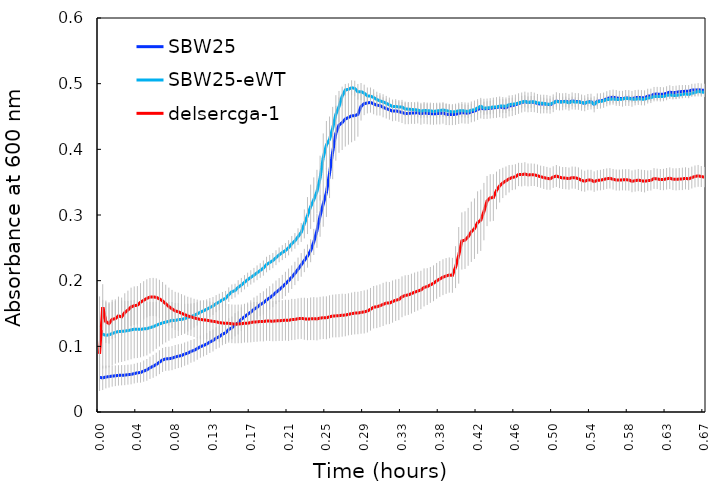
| Category | SBW25 | SBW25-eWT | delsercga-1 |
|---|---|---|---|
| 0.00010416666666666667 | 0.053 | 0.12 | 0.088 |
| 0.0035763888888888894 | 0.052 | 0.118 | 0.16 |
| 0.0070486111111111105 | 0.053 | 0.117 | 0.137 |
| 0.010520833333333333 | 0.054 | 0.118 | 0.135 |
| 0.013993055555555555 | 0.055 | 0.119 | 0.141 |
| 0.017465277777777777 | 0.055 | 0.121 | 0.142 |
| 0.020937499999999998 | 0.056 | 0.123 | 0.146 |
| 0.02440972222222222 | 0.056 | 0.123 | 0.145 |
| 0.027881944444444445 | 0.056 | 0.123 | 0.151 |
| 0.03135416666666666 | 0.057 | 0.124 | 0.155 |
| 0.034826388888888886 | 0.057 | 0.125 | 0.16 |
| 0.03829861111111111 | 0.058 | 0.126 | 0.162 |
| 0.04177083333333333 | 0.06 | 0.126 | 0.163 |
| 0.04524305555555556 | 0.06 | 0.126 | 0.167 |
| 0.04871527777777778 | 0.062 | 0.127 | 0.17 |
| 0.0521875 | 0.064 | 0.127 | 0.173 |
| 0.05565972222222223 | 0.067 | 0.128 | 0.175 |
| 0.059131944444444445 | 0.07 | 0.13 | 0.175 |
| 0.06260416666666667 | 0.072 | 0.132 | 0.175 |
| 0.06607638888888889 | 0.076 | 0.134 | 0.172 |
| 0.06954861111111112 | 0.079 | 0.136 | 0.169 |
| 0.07302083333333333 | 0.081 | 0.137 | 0.165 |
| 0.07649305555555556 | 0.081 | 0.138 | 0.161 |
| 0.07996527777777777 | 0.082 | 0.14 | 0.157 |
| 0.0834375 | 0.084 | 0.139 | 0.154 |
| 0.08690972222222222 | 0.085 | 0.141 | 0.153 |
| 0.09038194444444443 | 0.086 | 0.141 | 0.15 |
| 0.09385416666666667 | 0.088 | 0.142 | 0.148 |
| 0.09732638888888889 | 0.09 | 0.144 | 0.146 |
| 0.1007986111111111 | 0.092 | 0.145 | 0.145 |
| 0.10427083333333333 | 0.094 | 0.147 | 0.143 |
| 0.10774305555555556 | 0.097 | 0.149 | 0.142 |
| 0.11121527777777777 | 0.099 | 0.152 | 0.141 |
| 0.1146875 | 0.101 | 0.154 | 0.14 |
| 0.11815972222222222 | 0.104 | 0.156 | 0.14 |
| 0.12163194444444443 | 0.107 | 0.159 | 0.139 |
| 0.12510416666666666 | 0.109 | 0.161 | 0.138 |
| 0.1285763888888889 | 0.112 | 0.165 | 0.137 |
| 0.1320486111111111 | 0.115 | 0.168 | 0.136 |
| 0.13552083333333334 | 0.118 | 0.171 | 0.136 |
| 0.13899305555555555 | 0.121 | 0.173 | 0.135 |
| 0.14246527777777776 | 0.126 | 0.179 | 0.135 |
| 0.1459375 | 0.128 | 0.183 | 0.134 |
| 0.14940972222222224 | 0.133 | 0.185 | 0.134 |
| 0.15288194444444445 | 0.136 | 0.19 | 0.134 |
| 0.15635416666666666 | 0.141 | 0.193 | 0.134 |
| 0.1598263888888889 | 0.145 | 0.198 | 0.135 |
| 0.1632986111111111 | 0.149 | 0.201 | 0.135 |
| 0.16677083333333334 | 0.152 | 0.205 | 0.136 |
| 0.17024305555555555 | 0.156 | 0.208 | 0.137 |
| 0.17371527777777776 | 0.159 | 0.212 | 0.137 |
| 0.17718750000000003 | 0.164 | 0.215 | 0.138 |
| 0.18065972222222224 | 0.166 | 0.219 | 0.138 |
| 0.18413194444444445 | 0.171 | 0.225 | 0.139 |
| 0.18760416666666666 | 0.174 | 0.228 | 0.138 |
| 0.1910763888888889 | 0.178 | 0.231 | 0.138 |
| 0.1945486111111111 | 0.182 | 0.235 | 0.139 |
| 0.1980208333333333 | 0.186 | 0.239 | 0.139 |
| 0.20149305555555555 | 0.191 | 0.243 | 0.139 |
| 0.20496527777777776 | 0.195 | 0.246 | 0.14 |
| 0.20843750000000003 | 0.2 | 0.25 | 0.139 |
| 0.21190972222222224 | 0.205 | 0.256 | 0.141 |
| 0.21538194444444445 | 0.211 | 0.261 | 0.141 |
| 0.21885416666666668 | 0.217 | 0.267 | 0.142 |
| 0.2223263888888889 | 0.224 | 0.273 | 0.143 |
| 0.2257986111111111 | 0.231 | 0.286 | 0.142 |
| 0.2292708333333333 | 0.237 | 0.299 | 0.141 |
| 0.23274305555555555 | 0.246 | 0.313 | 0.142 |
| 0.23621527777777776 | 0.259 | 0.323 | 0.142 |
| 0.23968749999999997 | 0.276 | 0.336 | 0.142 |
| 0.24315972222222224 | 0.299 | 0.356 | 0.143 |
| 0.24663194444444445 | 0.317 | 0.388 | 0.144 |
| 0.2501041666666667 | 0.334 | 0.406 | 0.143 |
| 0.2535763888888889 | 0.364 | 0.415 | 0.145 |
| 0.2570486111111111 | 0.396 | 0.432 | 0.146 |
| 0.26052083333333337 | 0.424 | 0.453 | 0.146 |
| 0.2639930555555556 | 0.437 | 0.465 | 0.147 |
| 0.2674652777777778 | 0.441 | 0.481 | 0.147 |
| 0.27092592592592596 | 0.446 | 0.49 | 0.148 |
| 0.2744097222222222 | 0.448 | 0.491 | 0.149 |
| 0.2778819444444444 | 0.451 | 0.494 | 0.15 |
| 0.2813541666666666 | 0.451 | 0.493 | 0.151 |
| 0.2848263888888889 | 0.453 | 0.488 | 0.151 |
| 0.2882986111111111 | 0.465 | 0.488 | 0.152 |
| 0.29177083333333337 | 0.47 | 0.486 | 0.152 |
| 0.2952430555555556 | 0.471 | 0.481 | 0.154 |
| 0.2987152777777778 | 0.471 | 0.481 | 0.156 |
| 0.3021875 | 0.469 | 0.479 | 0.16 |
| 0.3056597222222222 | 0.467 | 0.476 | 0.16 |
| 0.3091319444444444 | 0.467 | 0.474 | 0.162 |
| 0.3126041666666666 | 0.464 | 0.472 | 0.164 |
| 0.3160763888888889 | 0.462 | 0.47 | 0.166 |
| 0.3195486111111111 | 0.46 | 0.468 | 0.166 |
| 0.3230208333333333 | 0.458 | 0.465 | 0.168 |
| 0.3264930555555556 | 0.459 | 0.465 | 0.17 |
| 0.3299652777777778 | 0.457 | 0.464 | 0.171 |
| 0.3334375 | 0.456 | 0.464 | 0.175 |
| 0.3369097222222222 | 0.455 | 0.462 | 0.177 |
| 0.3403819444444445 | 0.455 | 0.461 | 0.178 |
| 0.3438541666666666 | 0.455 | 0.461 | 0.18 |
| 0.3473263888888889 | 0.455 | 0.46 | 0.182 |
| 0.35079861111111116 | 0.456 | 0.46 | 0.184 |
| 0.3542708333333333 | 0.454 | 0.458 | 0.186 |
| 0.3577430555555556 | 0.455 | 0.459 | 0.19 |
| 0.3612152777777778 | 0.455 | 0.459 | 0.191 |
| 0.3646875 | 0.454 | 0.459 | 0.194 |
| 0.3681597222222222 | 0.454 | 0.458 | 0.196 |
| 0.3716319444444445 | 0.454 | 0.458 | 0.2 |
| 0.3751041666666666 | 0.455 | 0.459 | 0.203 |
| 0.3785763888888889 | 0.455 | 0.46 | 0.205 |
| 0.38204861111111116 | 0.453 | 0.459 | 0.207 |
| 0.3855208333333333 | 0.453 | 0.458 | 0.209 |
| 0.3889930555555556 | 0.453 | 0.457 | 0.208 |
| 0.3924652777777778 | 0.453 | 0.457 | 0.221 |
| 0.3959375 | 0.455 | 0.459 | 0.239 |
| 0.3994097222222222 | 0.456 | 0.459 | 0.26 |
| 0.4028819444444445 | 0.455 | 0.458 | 0.262 |
| 0.4063541666666666 | 0.455 | 0.458 | 0.267 |
| 0.4098263888888889 | 0.457 | 0.46 | 0.274 |
| 0.41329861111111116 | 0.458 | 0.46 | 0.279 |
| 0.4167708333333333 | 0.461 | 0.463 | 0.288 |
| 0.4202430555555556 | 0.463 | 0.466 | 0.292 |
| 0.4237152777777778 | 0.462 | 0.463 | 0.305 |
| 0.4271875 | 0.462 | 0.463 | 0.321 |
| 0.4306597222222222 | 0.462 | 0.464 | 0.326 |
| 0.4341319444444445 | 0.463 | 0.465 | 0.327 |
| 0.4376041666666666 | 0.464 | 0.464 | 0.337 |
| 0.4410763888888889 | 0.465 | 0.466 | 0.344 |
| 0.44454861111111116 | 0.463 | 0.466 | 0.349 |
| 0.4480208333333333 | 0.463 | 0.466 | 0.352 |
| 0.4514930555555556 | 0.466 | 0.468 | 0.355 |
| 0.4549652777777778 | 0.467 | 0.469 | 0.357 |
| 0.4584375 | 0.468 | 0.469 | 0.358 |
| 0.4619097222222222 | 0.47 | 0.471 | 0.362 |
| 0.4653819444444445 | 0.471 | 0.472 | 0.361 |
| 0.4688541666666666 | 0.473 | 0.473 | 0.362 |
| 0.4723263888888889 | 0.471 | 0.471 | 0.361 |
| 0.47579861111111116 | 0.472 | 0.472 | 0.361 |
| 0.4792708333333333 | 0.471 | 0.472 | 0.361 |
| 0.4827430555555556 | 0.47 | 0.471 | 0.36 |
| 0.4862152777777778 | 0.469 | 0.47 | 0.358 |
| 0.4896875 | 0.469 | 0.47 | 0.357 |
| 0.4931597222222222 | 0.469 | 0.469 | 0.356 |
| 0.4966319444444445 | 0.468 | 0.469 | 0.355 |
| 0.5001041666666667 | 0.47 | 0.471 | 0.358 |
| 0.5035763888888889 | 0.474 | 0.473 | 0.359 |
| 0.5070486111111111 | 0.472 | 0.472 | 0.358 |
| 0.5105208333333333 | 0.472 | 0.472 | 0.356 |
| 0.5139930555555555 | 0.473 | 0.473 | 0.356 |
| 0.5174652777777778 | 0.472 | 0.471 | 0.355 |
| 0.5209374999999999 | 0.474 | 0.473 | 0.357 |
| 0.5244097222222223 | 0.473 | 0.472 | 0.357 |
| 0.5278819444444445 | 0.473 | 0.472 | 0.355 |
| 0.5313541666666667 | 0.471 | 0.471 | 0.353 |
| 0.5348263888888889 | 0.47 | 0.47 | 0.351 |
| 0.5382986111111111 | 0.472 | 0.472 | 0.353 |
| 0.5417708333333333 | 0.473 | 0.472 | 0.353 |
| 0.5452430555555555 | 0.469 | 0.469 | 0.351 |
| 0.5487152777777778 | 0.473 | 0.472 | 0.353 |
| 0.5521874999999999 | 0.474 | 0.473 | 0.353 |
| 0.5556597222222223 | 0.475 | 0.474 | 0.354 |
| 0.5591319444444445 | 0.477 | 0.476 | 0.355 |
| 0.5626041666666667 | 0.479 | 0.476 | 0.356 |
| 0.5660763888888889 | 0.479 | 0.477 | 0.354 |
| 0.5695486111111111 | 0.478 | 0.476 | 0.353 |
| 0.5730208333333333 | 0.478 | 0.476 | 0.353 |
| 0.5764930555555555 | 0.477 | 0.476 | 0.354 |
| 0.5799652777777778 | 0.478 | 0.478 | 0.354 |
| 0.5834374999999999 | 0.478 | 0.477 | 0.353 |
| 0.5869097222222223 | 0.477 | 0.477 | 0.351 |
| 0.5903819444444445 | 0.479 | 0.476 | 0.352 |
| 0.5938541666666667 | 0.479 | 0.477 | 0.353 |
| 0.5973263888888889 | 0.479 | 0.476 | 0.352 |
| 0.6007986111111111 | 0.478 | 0.476 | 0.351 |
| 0.6042708333333333 | 0.481 | 0.478 | 0.352 |
| 0.6077430555555555 | 0.481 | 0.479 | 0.353 |
| 0.6112152777777778 | 0.484 | 0.48 | 0.356 |
| 0.6146874999999999 | 0.484 | 0.481 | 0.355 |
| 0.6181597222222223 | 0.484 | 0.48 | 0.354 |
| 0.6216319444444445 | 0.484 | 0.48 | 0.354 |
| 0.6251041666666667 | 0.485 | 0.482 | 0.355 |
| 0.6285763888888889 | 0.487 | 0.483 | 0.356 |
| 0.6320486111111111 | 0.486 | 0.482 | 0.355 |
| 0.6355208333333333 | 0.487 | 0.482 | 0.354 |
| 0.6389930555555555 | 0.488 | 0.483 | 0.355 |
| 0.6424652777777778 | 0.488 | 0.483 | 0.355 |
| 0.6459374999999999 | 0.488 | 0.485 | 0.356 |
| 0.6494097222222223 | 0.488 | 0.483 | 0.355 |
| 0.6528819444444445 | 0.49 | 0.485 | 0.357 |
| 0.6563541666666667 | 0.49 | 0.486 | 0.359 |
| 0.6598263888888889 | 0.491 | 0.488 | 0.36 |
| 0.6632986111111111 | 0.49 | 0.487 | 0.359 |
| 0.6667708333333334 | 0.49 | 0.487 | 0.358 |